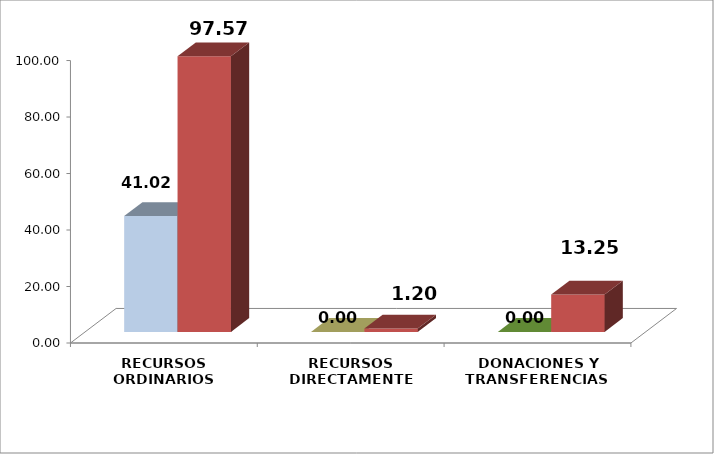
| Category | 1er Trimestre | 2do Trimestre |
|---|---|---|
| RECURSOS ORDINARIOS | 41.016 | 97.57 |
| RECURSOS DIRECTAMENTE RECAUDADOS  | 0 | 1.197 |
| DONACIONES Y TRANSFERENCIAS  | 0 | 13.25 |